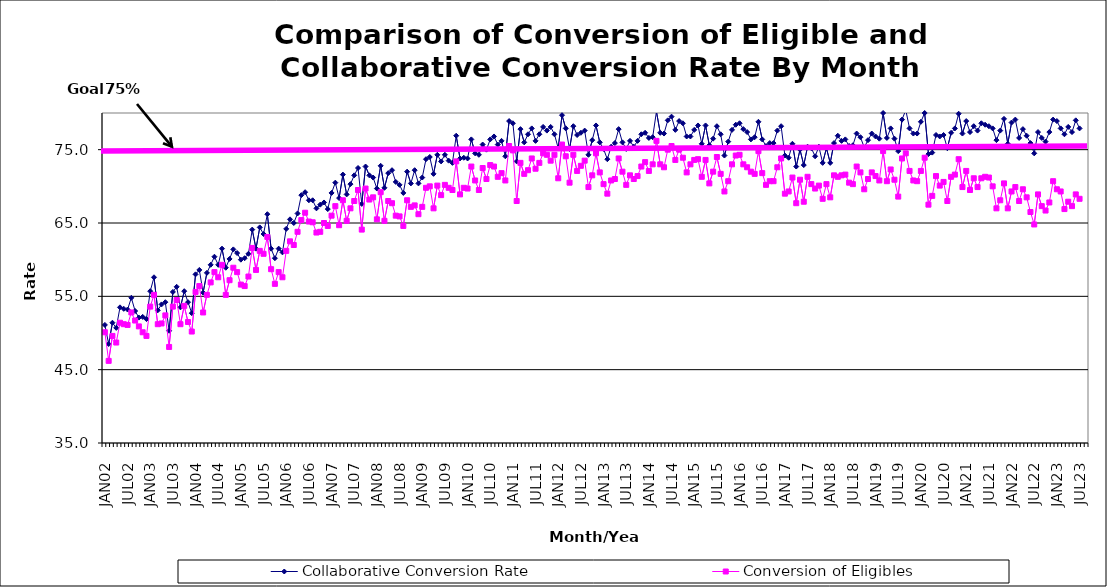
| Category | Collaborative Conversion Rate | Conversion of Eligibles |
|---|---|---|
| JAN02 | 51.1 | 50.1 |
| FEB02 | 48.5 | 46.2 |
| MAR02 | 51.4 | 49.6 |
| APR02 | 50.7 | 48.7 |
| MAY02 | 53.5 | 51.4 |
| JUN02 | 53.3 | 51.2 |
| JUL02 | 53.2 | 51.1 |
| AUG02 | 54.8 | 52.8 |
| SEP02 | 53 | 51.7 |
| OCT02 | 52.1 | 50.9 |
| NOV02 | 52.2 | 50.1 |
| DEC02 | 51.9 | 49.6 |
| JAN03 | 55.7 | 53.6 |
| FEB03 | 57.6 | 55.2 |
| MAR03 | 53.1 | 51.2 |
| APR03 | 53.9 | 51.3 |
| MAY03 | 54.2 | 52.4 |
| JUN03 | 50.3 | 48.1 |
| JUL03 | 55.6 | 53.6 |
| AUG03 | 56.3 | 54.5 |
| SEP03 | 53.5 | 51.2 |
| OCT03 | 55.7 | 53.7 |
| NOV03 | 54.2 | 51.5 |
| DEC03 | 52.7 | 50.2 |
| JAN04 | 58 | 55.6 |
| FEB04 | 58.6 | 56.4 |
| MAR04 | 55.5 | 52.8 |
| APR04 | 58.2 | 55.2 |
| MAY04 | 59.3 | 56.9 |
| JUN04 | 60.4 | 58.3 |
| JUL04 | 59.3 | 57.6 |
| AUG04 | 61.5 | 59.3 |
| SEP04 | 58.9 | 55.2 |
| OCT04 | 60.1 | 57.2 |
| NOV04 | 61.4 | 58.9 |
| DEC04 | 60.9 | 58.3 |
| JAN05 | 60 | 56.6 |
| FEB05 | 60.2 | 56.4 |
| MAR05 | 60.8 | 57.7 |
| APR05 | 64.1 | 61.6 |
| MAY05 | 61.5 | 58.6 |
| JUN05 | 64.4 | 61.2 |
| JUL05 | 63.5 | 60.8 |
| AUG05 | 66.2 | 63.1 |
| SEP05 | 61.5 | 58.7 |
| OCT05 | 60.2 | 56.7 |
| NOV05 | 61.5 | 58.3 |
| DEC05 | 61 | 57.6 |
| JAN06 | 64.2 | 61.2 |
| FEB06 | 65.5 | 62.5 |
| MAR06 | 65 | 62 |
| APR06 | 66.3 | 63.8 |
| MAY06 | 68.8 | 65.4 |
| JUN06 | 69.2 | 66.4 |
| JUL06 | 68.1 | 65.2 |
| AUG06 | 68.1 | 65.1 |
| SEP06 | 67 | 63.7 |
| OCT06 | 67.5 | 63.8 |
| NOV06 | 67.8 | 65 |
| DEC06 | 66.9 | 64.6 |
| JAN07 | 69.1 | 66 |
| FEB07 | 70.5 | 67.3 |
| MAR07 | 68.4 | 64.7 |
| APR07 | 71.6 | 68.1 |
| MAY07 | 68.9 | 65.3 |
| JUN07 | 70.3 | 67 |
| JUL07 | 71.5 | 68 |
| AUG07 | 72.5 | 69.5 |
| SEP07 | 67.6 | 64.1 |
| OCT07 | 72.7 | 69.7 |
| NOV07 | 71.5 | 68.2 |
| DEC07 | 71.2 | 68.5 |
| JAN08 | 69.7 | 65.5 |
| FEB08 | 72.8 | 69.2 |
| MAR08 | 69.8 | 65.3 |
| APR08 | 71.8 | 68 |
| MAY08 | 72.2 | 67.7 |
| JUN08 | 70.6 | 66 |
| JUL08 | 70.2 | 65.9 |
| AUG08 | 69.1 | 64.6 |
| SEP08 | 72 | 68.1 |
| OCT08 | 70.4 | 67.2 |
| NOV08 | 72.2 | 67.4 |
| DEC08 | 70.4 | 66.2 |
| JAN09 | 71.2 | 67.2 |
| FEB09 | 73.7 | 69.8 |
| MAR09 | 74 | 70 |
| APR09 | 71.7 | 67 |
| MAY09 | 74.3 | 70.1 |
| JUN09 | 73.4 | 68.8 |
| JUL09 | 74.3 | 70.2 |
| AUG09 | 73.5 | 69.8 |
| SEP09 | 73.2 | 69.5 |
| OCT09 | 76.9 | 73.4 |
| NOV09 | 73.8 | 68.9 |
| DEC09 | 73.9 | 69.8 |
| JAN10 | 73.8 | 69.7 |
| FEB10 | 76.4 | 72.7 |
| MAR10 | 74.5 | 70.8 |
| APR10 | 74.3 | 69.5 |
| MAY10 | 75.7 | 72.5 |
| JUN10 | 75 | 71 |
| JUL10 | 76.4 | 72.9 |
| AUG10 | 76.8 | 72.7 |
| SEP10 | 75.7 | 71.3 |
| OCT10 | 76.2 | 71.8 |
| NOV10 | 74.1 | 70.8 |
| DEC10 | 78.9 | 75.5 |
| JAN11 | 78.6 | 74.9 |
| FEB11 | 73.4 | 68 |
| MAR11 | 77.8 | 73.2 |
| APR11 | 76 | 71.7 |
| MAY11 | 77.1 | 72.2 |
| JUN11 | 77.9 | 73.8 |
| JUL11 | 76.2 | 72.4 |
| AUG11 | 77.1 | 73.2 |
| SEP11 | 78.1 | 74.5 |
| OCT11 | 77.6 | 74.3 |
| NOV11 | 78.1 | 73.5 |
| DEC11 | 77.1 | 74.3 |
| JAN12 | 75.2 | 71.1 |
| FEB12 | 79.7 | 75.7 |
| MAR12 | 77.9 | 74.1 |
| APR12 | 75.1 | 70.5 |
| MAY12 | 78.2 | 74.3 |
| JUN12 | 77 | 72.1 |
| JUL12 | 77.3 | 72.8 |
| AUG12 | 77.6 | 73.5 |
| SEP12 | 74.3 | 69.9 |
| OCT12 | 76.3 | 71.5 |
| NOV12 | 78.3 | 74.5 |
| DEC12 | 76 | 71.9 |
| JAN13 | 75.1 | 70.3 |
| FEB13 | 73.7 | 69 |
| MAR13 | 75.4 | 70.8 |
| APR13 | 75.9 | 71 |
| MAY13 | 77.8 | 73.8 |
| JUN13 | 76 | 72 |
| JUL13 | 75.1 | 70.2 |
| AUG13 | 76.2 | 71.5 |
| SEP13 | 75.4 | 71 |
| OCT13 | 76.2 | 71.4 |
| NOV13 | 77.1 | 72.7 |
| DEC13 | 77.3 | 73.3 |
| JAN14 | 76.6 | 72.1 |
| FEB14 | 76.7 | 73 |
| MAR14 | 80.2 | 76.2 |
| APR14 | 77.3 | 73 |
| MAY14 | 77.2 | 72.6 |
| JUN14 | 79 | 75 |
| JUL14 | 79.5 | 75.5 |
| AUG14 | 77.7 | 73.6 |
| SEP14 | 78.9 | 75 |
| OCT14 | 78.6 | 73.9 |
| NOV14 | 76.8 | 71.9 |
| DEC14 | 76.8 | 73 |
| JAN15 | 77.7 | 73.6 |
| FEB15 | 78.3 | 73.7 |
| MAR15 | 75.8 | 71.3 |
| APR15 | 78.3 | 73.6 |
| MAY15 | 75.6 | 70.4 |
| JUN15 | 76.5 | 72 |
| JUL15 | 78.2 | 74 |
| AUG15 | 77.1 | 71.7 |
| SEP15 | 74.2 | 69.3 |
| OCT15 | 76.1 | 70.7 |
| NOV15 | 77.7 | 73 |
| DEC15 | 78.4 | 74.2 |
| JAN16 | 78.6 | 74.3 |
| FEB16 | 77.8 | 73 |
| MAR16 | 77.4 | 72.6 |
| APR16 | 76.4 | 72 |
| MAY16 | 76.7 | 71.7 |
| JUN16 | 78.8 | 74.8 |
| JUL16 | 76.4 | 71.8 |
| AUG16 | 75.5 | 70.2 |
| SEP16 | 75.9 | 70.7 |
| OCT16 | 75.9 | 70.7 |
| NOV16 | 77.6 | 72.6 |
| DEC16 | 78.2 | 73.8 |
| JAN17 | 74.2 | 69 |
| FEB17 | 73.9 | 69.3 |
| MAR17 | 75.8 | 71.2 |
| APR17 | 72.7 | 67.7 |
| MAY17 | 75 | 70.9 |
| JUN17 | 72.9 | 67.9 |
| JUL17 | 75.4 | 71.3 |
| AUG17 | 75.2 | 70.3 |
| SEP17 | 74.1 | 69.7 |
| OCT17 | 75.4 | 70.1 |
| NOV17 | 73.2 | 68.3 |
| DEC17 | 75.2 | 70.3 |
| JAN18 | 73.2 | 68.5 |
| FEB18 | 75.9 | 71.5 |
| MAR18 | 76.9 | 71.3 |
| APR18 | 76.2 | 71.5 |
| MAY18 | 76.4 | 71.6 |
| JUN18 | 75.5 | 70.5 |
| JUL18 | 75.6 | 70.3 |
| AUG18 | 77.2 | 72.7 |
| SEP18 | 76.7 | 71.9 |
| OCT18 | 75.3 | 69.6 |
| NOV18 | 76.3 | 71 |
| DEC18 | 77.2 | 71.9 |
| JAN19 | 76.8 | 71.4 |
| FEB19 | 76.5 | 70.8 |
| MAR19 | 80 | 74.8 |
| APR19 | 76.6 | 70.7 |
| MAY19 | 77.9 | 72.3 |
| JUN19 | 76.5 | 70.9 |
| JUL19 | 74.8 | 68.6 |
| AUG19 | 79.1 | 73.8 |
| SEP19 | 80.4 | 74.5 |
| OCT19 | 77.9 | 72.1 |
| NOV19 | 77.2 | 70.8 |
| DEC19 | 77.2 | 70.7 |
| JAN20 | 78.8 | 72.1 |
| FEB20 | 80 | 73.9 |
| MAR20 | 74.4 | 67.5 |
| APR20 | 74.6 | 68.7 |
| MAY20 | 77 | 71.4 |
| JUN20 | 76.8 | 70.1 |
| JUL20 | 77 | 70.6 |
| AUG20 | 75.2 | 68 |
| SEP20 | 77.3 | 71.3 |
| OCT20 | 77.9 | 71.6 |
| NOV20 | 79.9 | 73.7 |
| DEC20 | 77.2 | 69.9 |
| JAN21 | 78.9 | 72.1 |
| FEB21 | 77.4 | 69.5 |
| MAR21 | 78.2 | 71.1 |
| APR21 | 77.6 | 69.9 |
| MAY21 | 78.6 | 71.1 |
| JUN21 | 78.4 | 71.3 |
| JUL21 | 78.2 | 71.2 |
| AUG21 | 77.9 | 70 |
| SEP21 | 76.3 | 67 |
| OCT21 | 77.6 | 68.1 |
| NOV21 | 79.2 | 70.4 |
| DEC21 | 75.8 | 67 |
| JAN22 | 78.7 | 69.3 |
| FEB22 | 79.1 | 69.9 |
| MAR22 | 76.6 | 68 |
| APR22 | 77.8 | 69.6 |
| MAY22 | 76.9 | 68.5 |
| JUN22 | 75.9 | 66.5 |
| JUL22 | 74.5 | 64.8 |
| AUG22 | 77.4 | 68.9 |
| SEP22 | 76.6 | 67.3 |
| OCT22 | 76.1 | 66.7 |
| NOV22 | 77.4 | 67.8 |
| DEC22 | 79.1 | 70.7 |
| JAN23 | 78.9 | 69.6 |
| FEB23 | 77.9 | 69.3 |
| MAR23 | 77.1 | 66.9 |
| APR23 | 78.1 | 67.9 |
| MAY23 | 77.4 | 67.3 |
| JUN23 | 79 | 68.9 |
| JUL23 | 77.9 | 68.3 |